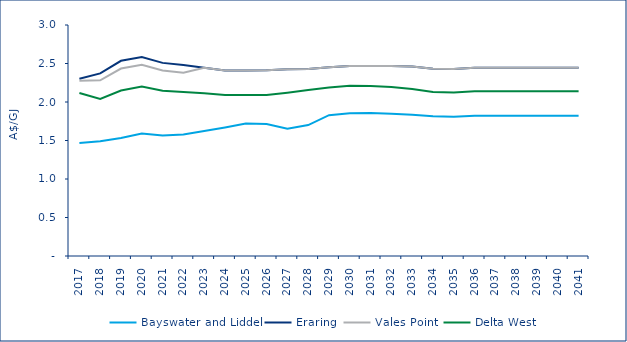
| Category | Bayswater and Liddel | Eraring | Vales Point | Delta West |
|---|---|---|---|---|
| 2017.0 | 1.466 | 2.303 | 2.275 | 2.118 |
| 2018.0 | 1.491 | 2.372 | 2.282 | 2.041 |
| 2019.0 | 1.532 | 2.535 | 2.435 | 2.149 |
| 2020.0 | 1.59 | 2.584 | 2.484 | 2.201 |
| 2021.0 | 1.566 | 2.508 | 2.408 | 2.145 |
| 2022.0 | 1.578 | 2.479 | 2.379 | 2.129 |
| 2023.0 | 1.622 | 2.445 | 2.445 | 2.113 |
| 2024.0 | 1.669 | 2.409 | 2.409 | 2.091 |
| 2025.0 | 1.72 | 2.409 | 2.409 | 2.091 |
| 2026.0 | 1.714 | 2.412 | 2.412 | 2.091 |
| 2027.0 | 1.653 | 2.426 | 2.426 | 2.121 |
| 2028.0 | 1.7 | 2.43 | 2.43 | 2.157 |
| 2029.0 | 1.829 | 2.451 | 2.451 | 2.187 |
| 2030.0 | 1.854 | 2.469 | 2.469 | 2.211 |
| 2031.0 | 1.858 | 2.467 | 2.467 | 2.208 |
| 2032.0 | 1.846 | 2.468 | 2.468 | 2.196 |
| 2033.0 | 1.834 | 2.46 | 2.46 | 2.168 |
| 2034.0 | 1.814 | 2.433 | 2.433 | 2.131 |
| 2035.0 | 1.809 | 2.427 | 2.427 | 2.125 |
| 2036.0 | 1.822 | 2.444 | 2.444 | 2.14 |
| 2037.0 | 1.822 | 2.444 | 2.444 | 2.14 |
| 2038.0 | 1.822 | 2.444 | 2.444 | 2.14 |
| 2039.0 | 1.822 | 2.444 | 2.444 | 2.14 |
| 2040.0 | 1.822 | 2.444 | 2.444 | 2.14 |
| 2041.0 | 1.822 | 2.444 | 2.444 | 2.14 |